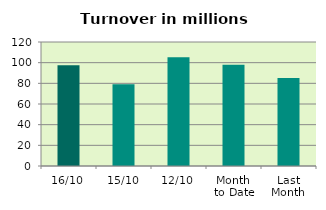
| Category | Series 0 |
|---|---|
| 16/10 | 97.485 |
| 15/10 | 79.102 |
| 12/10 | 105.176 |
| Month 
to Date | 97.973 |
| Last
Month | 85.072 |